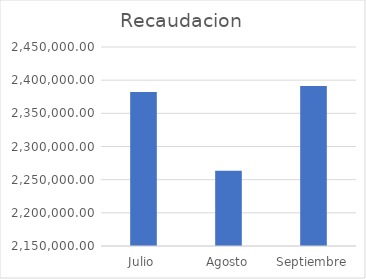
| Category | Recaudacion |
|---|---|
| Julio | 2382213 |
| Agosto | 2263590 |
| Septiembre | 2391181 |